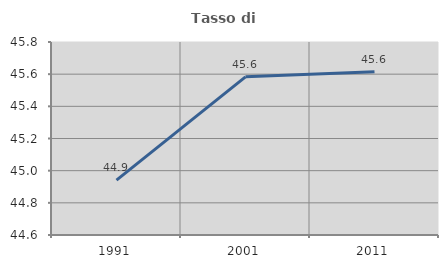
| Category | Tasso di occupazione   |
|---|---|
| 1991.0 | 44.942 |
| 2001.0 | 45.583 |
| 2011.0 | 45.614 |